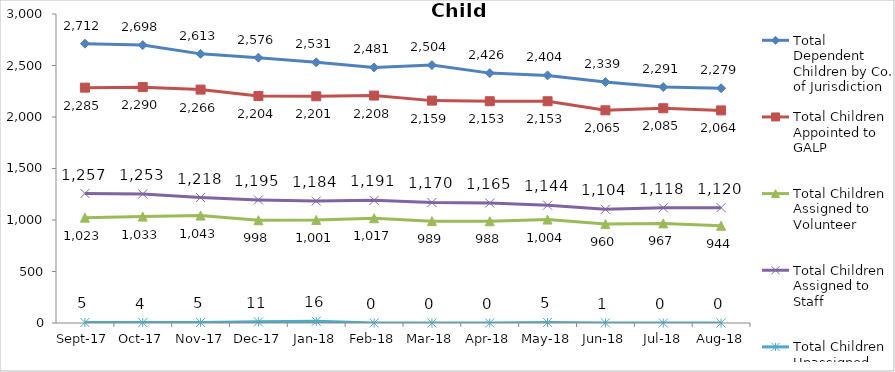
| Category | Total Dependent Children by Co. of Jurisdiction | Total Children Appointed to GALP | Total Children Assigned to Volunteer | Total Children Assigned to Staff | Total Children Unassigned |
|---|---|---|---|---|---|
| 2017-09-01 | 2712 | 2285 | 1023 | 1257 | 5 |
| 2017-10-01 | 2698 | 2290 | 1033 | 1253 | 4 |
| 2017-11-01 | 2613 | 2266 | 1043 | 1218 | 5 |
| 2017-12-01 | 2576 | 2204 | 998 | 1195 | 11 |
| 2018-01-01 | 2531 | 2201 | 1001 | 1184 | 16 |
| 2018-02-01 | 2481 | 2208 | 1017 | 1191 | 0 |
| 2018-03-01 | 2504 | 2159 | 989 | 1170 | 0 |
| 2018-04-01 | 2426 | 2153 | 988 | 1165 | 0 |
| 2018-05-01 | 2404 | 2153 | 1004 | 1144 | 5 |
| 2018-06-01 | 2339 | 2065 | 960 | 1104 | 1 |
| 2018-07-01 | 2291 | 2085 | 967 | 1118 | 0 |
| 2018-08-01 | 2279 | 2064 | 944 | 1120 | 0 |